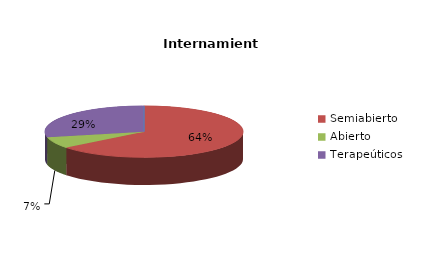
| Category | Series 0 |
|---|---|
| Cerrado | 0 |
| Semiabierto | 9 |
| Abierto | 1 |
| Terapeúticos | 4 |